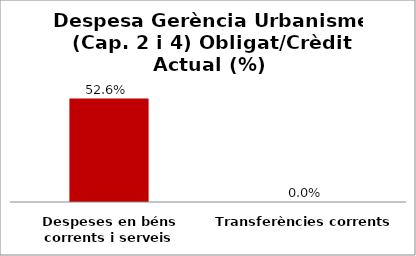
| Category | Series 0 |
|---|---|
| Despeses en béns corrents i serveis | 0.526 |
| Transferències corrents | 0 |